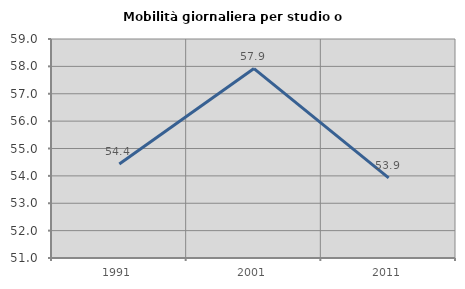
| Category | Mobilità giornaliera per studio o lavoro |
|---|---|
| 1991.0 | 54.435 |
| 2001.0 | 57.921 |
| 2011.0 | 53.927 |